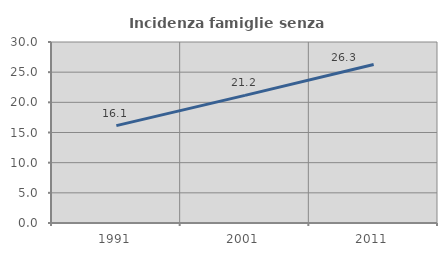
| Category | Incidenza famiglie senza nuclei |
|---|---|
| 1991.0 | 16.138 |
| 2001.0 | 21.152 |
| 2011.0 | 26.267 |